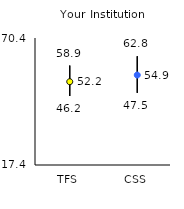
| Category | 25th | 75th | Mean |
|---|---|---|---|
| TFS | 46.2 | 58.9 | 52.16 |
| CSS | 47.5 | 62.8 | 54.94 |